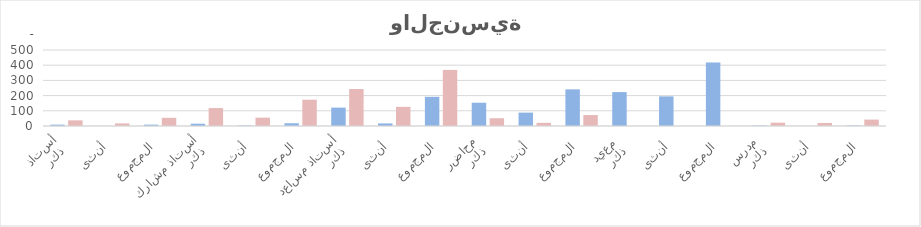
| Category | Series 0 | Series 1 |
|---|---|---|
| 0 | 9 | 37 |
| 1 | 0 | 17 |
| 2 | 9 | 54 |
| 3 | 15 | 118 |
| 4 | 3 | 55 |
| 5 | 18 | 173 |
| 6 | 121 | 243 |
| 7 | 17 | 126 |
| 8 | 192 | 369 |
| 9 | 153 | 51 |
| 10 | 88 | 21 |
| 11 | 241 | 72 |
| 12 | 223 | 0 |
| 13 | 195 | 0 |
| 14 | 418 | 0 |
| 15 | 3 | 22 |
| 16 | 0 | 20 |
| 17 | 3 | 42 |